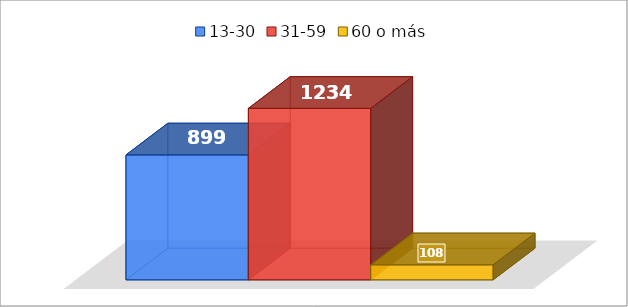
| Category | 13-30 | 31-59 | 60 o más |
|---|---|---|---|
| 0 | 899 | 1234 | 108 |